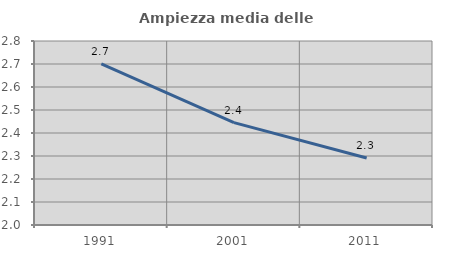
| Category | Ampiezza media delle famiglie |
|---|---|
| 1991.0 | 2.7 |
| 2001.0 | 2.445 |
| 2011.0 | 2.291 |